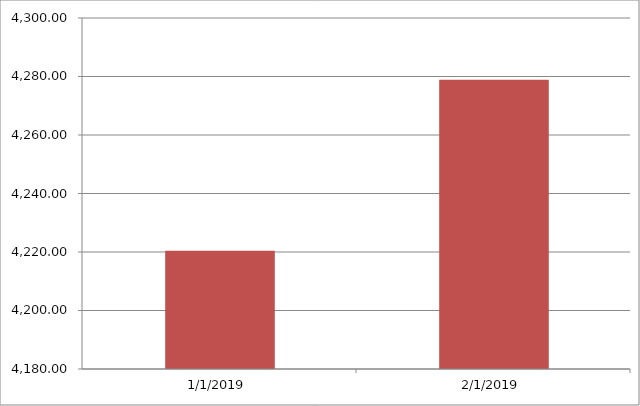
| Category | Series 0 | Series 1 |
|---|---|---|
| 1/1/19 |  | 4220.44 |
| 2/1/19 |  | 4278.86 |